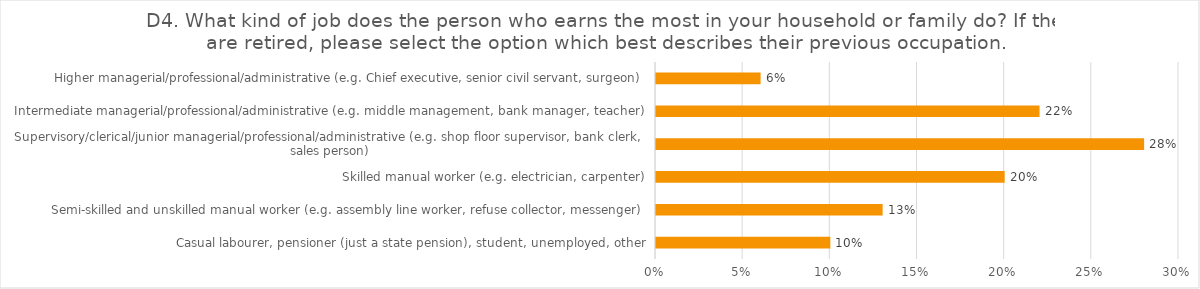
| Category | D4. What kind of job does the person who earns the most in your household or family do? If they are retired, please select the option which best describes their previous occupation. |
|---|---|
| Casual labourer, pensioner (just a state pension), student, unemployed, other | 0.1 |
| Semi-skilled and unskilled manual worker (e.g. assembly line worker, refuse collector, messenger) | 0.13 |
| Skilled manual worker (e.g. electrician, carpenter) | 0.2 |
| Supervisory/clerical/junior managerial/professional/administrative (e.g. shop floor supervisor, bank clerk, sales person) | 0.28 |
| Intermediate managerial/professional/administrative (e.g. middle management, bank manager, teacher) | 0.22 |
| Higher managerial/professional/administrative (e.g. Chief executive, senior civil servant, surgeon) | 0.06 |